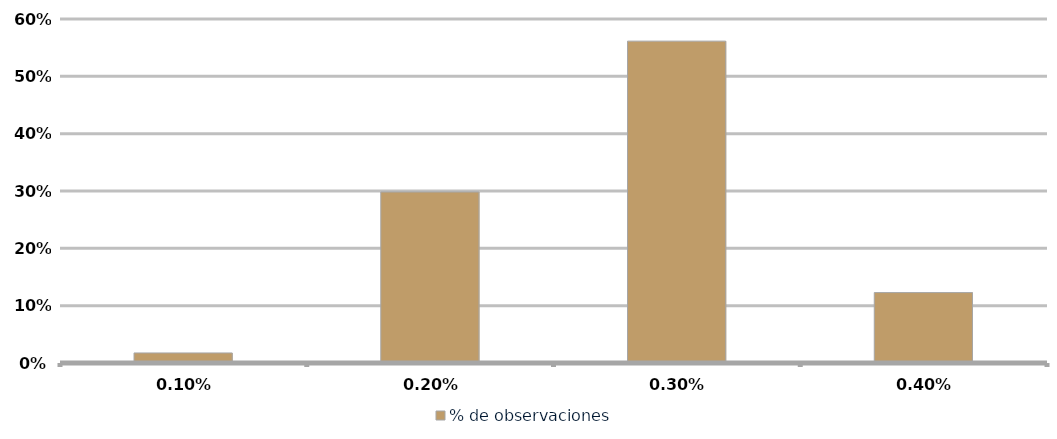
| Category | % de observaciones  |
|---|---|
| 0.001 | 0.018 |
| 0.002 | 0.298 |
| 0.003 | 0.561 |
| 0.004 | 0.123 |